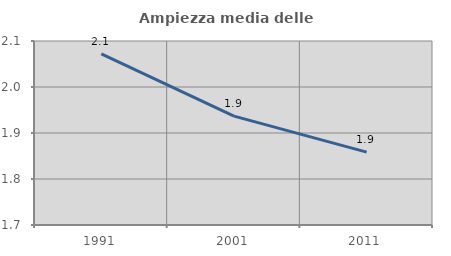
| Category | Ampiezza media delle famiglie |
|---|---|
| 1991.0 | 2.072 |
| 2001.0 | 1.937 |
| 2011.0 | 1.859 |